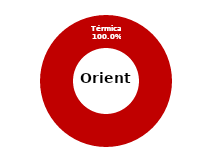
| Category | Oriente |
|---|---|
| Eólica | 0 |
| Hidráulica | 0 |
| Solar | 0 |
| Térmica | 33.83 |